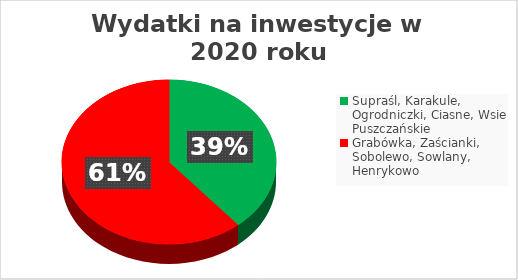
| Category | Series 0 |
|---|---|
| Supraśl, Karakule, Ogrodniczki, Ciasne, Wsie Puszczańskie | 8223601.56 |
| Grabówka, Zaścianki, Sobolewo, Sowlany, Henrykowo | 12942993.31 |